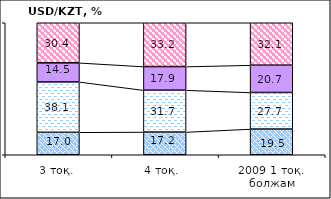
| Category | жоғарылайды | өзгермейді | төмендейді | #ССЫЛКА! |
|---|---|---|---|---|
| 3 тоқ. | 17.02 | 38.14 | 14.47 | 30.37 |
| 4 тоқ.  | 17.21 | 31.71 | 17.87 | 33.21 |
| 2009 1 тоқ. болжам | 19.48 | 27.7 | 20.68 | 32.13 |